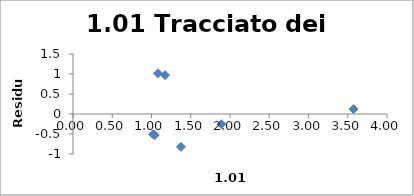
| Category | Series 0 |
|---|---|
| 1.0201 | -0.506 |
| 1.04060401 | -0.527 |
| 1.0828567056280802 | 1.017 |
| 1.1725786449236988 | 0.972 |
| 1.3749406785310976 | -0.822 |
| 1.890461869479555 | -0.255 |
| 3.573846079956134 | 0.123 |